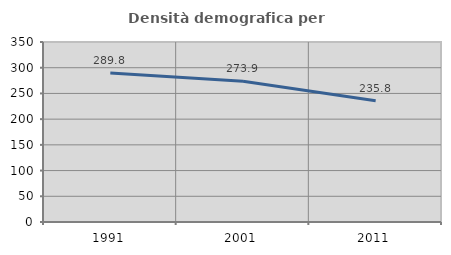
| Category | Densità demografica |
|---|---|
| 1991.0 | 289.773 |
| 2001.0 | 273.879 |
| 2011.0 | 235.848 |